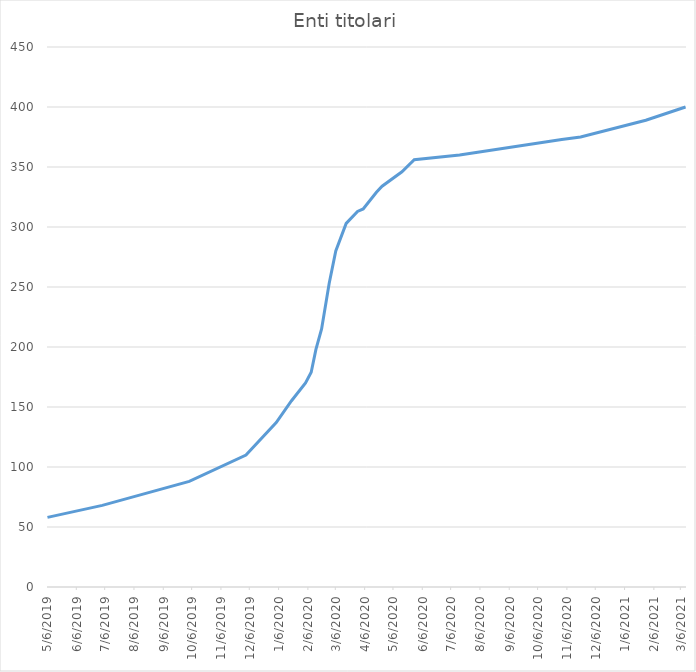
| Category | Enti titolari |
|---|---|
| 5/6/19 | 58 |
| 7/3/19 | 68 |
| 10/3/19 | 88 |
| 12/2/19 | 110 |
| 1/3/20 | 137 |
| 1/19/20 | 155 |
| 2/3/20 | 170 |
| 2/9/20 | 179 |
| 2/14/20 | 198 |
| 2/20/20 | 215 |
| 2/28/20 | 253 |
| 3/6/20 | 280 |
| 3/17/20 | 303 |
| 3/29/20 | 313 |
| 4/4/20 | 315 |
| 4/18/20 | 329 |
| 4/24/20 | 334 |
| 5/15/20 | 346 |
| 5/28/20 | 356 |
| 7/15/20 | 360 |
| 10/31/20 | 373 |
| 11/20/20 | 375 |
| 1/28/21 | 389 |
| 3/11/21 | 400 |